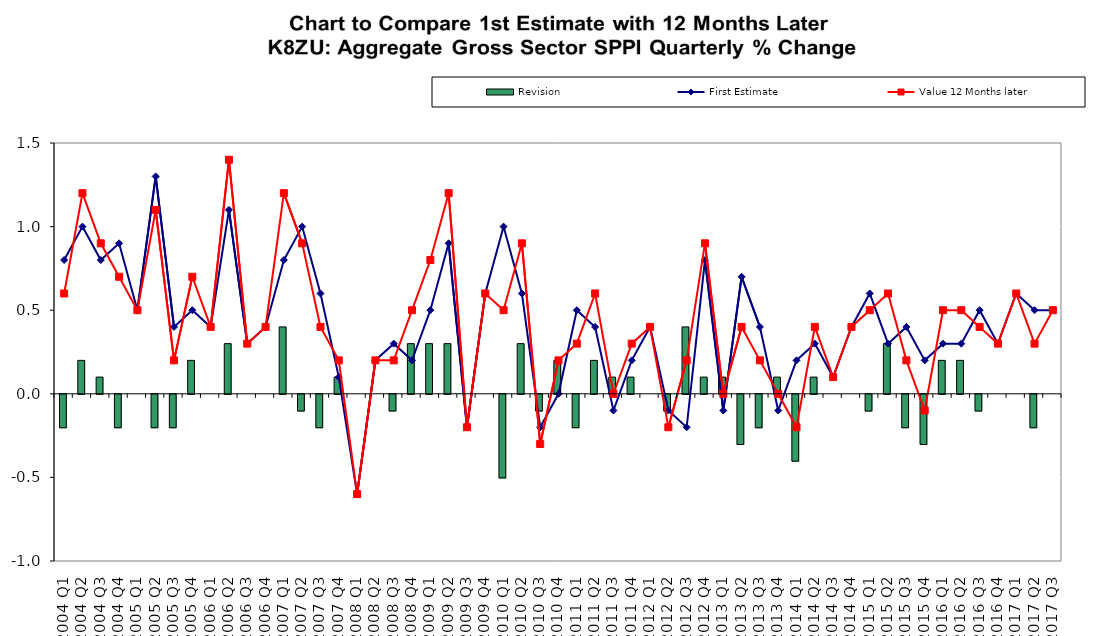
| Category | Revision |
|---|---|
| 2004 Q1 | -0.2 |
| 2004 Q2 | 0.2 |
| 2004 Q3 | 0.1 |
| 2004 Q4 | -0.2 |
| 2005 Q1 | 0 |
| 2005 Q2 | -0.2 |
| 2005 Q3 | -0.2 |
| 2005 Q4 | 0.2 |
| 2006 Q1 | 0 |
| 2006 Q2 | 0.3 |
| 2006 Q3 | 0 |
| 2006 Q4 | 0 |
| 2007 Q1 | 0.4 |
| 2007 Q2 | -0.1 |
| 2007 Q3 | -0.2 |
| 2007 Q4 | 0.1 |
| 2008 Q1 | 0 |
| 2008 Q2 | 0 |
| 2008 Q3 | -0.1 |
| 2008 Q4 | 0.3 |
| 2009 Q1 | 0.3 |
| 2009 Q2 | 0.3 |
| 2009 Q3 | 0 |
| 2009 Q4 | 0 |
| 2010 Q1 | -0.5 |
| 2010 Q2 | 0.3 |
| 2010 Q3 | -0.1 |
| 2010 Q4 | 0.2 |
| 2011 Q1 | -0.2 |
| 2011 Q2 | 0.2 |
| 2011 Q3 | 0.1 |
| 2011 Q4 | 0.1 |
| 2012 Q1 | 0 |
| 2012 Q2 | -0.1 |
| 2012 Q3 | 0.4 |
| 2012 Q4 | 0.1 |
| 2013 Q1 | 0.1 |
| 2013 Q2 | -0.3 |
| 2013 Q3 | -0.2 |
| 2013 Q4 | 0.1 |
| 2014 Q1 | -0.4 |
| 2014 Q2 | 0.1 |
| 2014 Q3 | 0 |
| 2014 Q4 | 0 |
| 2015 Q1 | -0.1 |
| 2015 Q2 | 0.3 |
| 2015 Q3 | -0.2 |
| 2015 Q4 | -0.3 |
| 2016 Q1 | 0.2 |
| 2016 Q2 | 0.2 |
| 2016 Q3 | -0.1 |
| 2016 Q4 | 0 |
| 2017 Q1 | 0 |
| 2017 Q2 | -0.2 |
| 2017 Q3 | 0 |